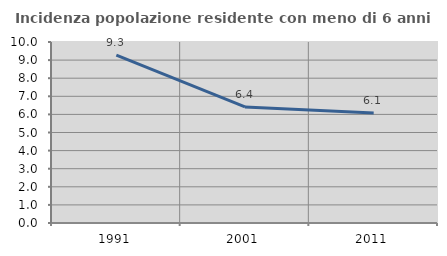
| Category | Incidenza popolazione residente con meno di 6 anni |
|---|---|
| 1991.0 | 9.274 |
| 2001.0 | 6.41 |
| 2011.0 | 6.076 |